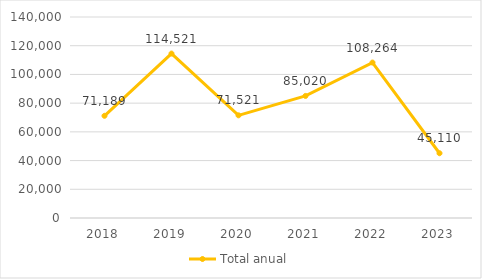
| Category | Total anual |
|---|---|
| 2018 | 71189 |
| 2019 | 114521 |
| 2020 | 71521 |
| 2021 | 85020 |
| 2022 | 108264 |
| 2023 | 45110 |